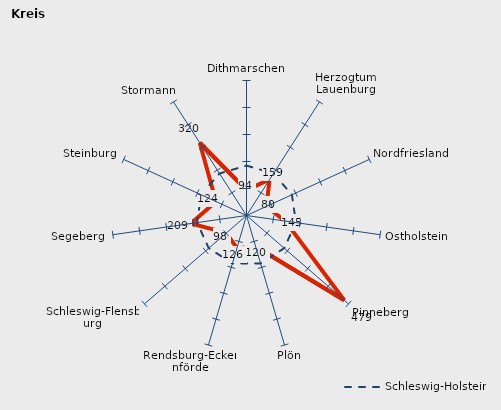
| Category | Kreise | Schleswig-Holstein |
|---|---|---|
| Dithmarschen | 93.804 | 184.887 |
| Herzogtum Lauenburg | 158.993 | 184.887 |
| Nordfriesland | 80.42 | 184.887 |
| Ostholstein | 145.019 | 184.887 |
| Pinneberg | 479.223 | 184.887 |
| Plön | 119.686 | 184.887 |
| Rendsburg-Eckernförde | 126.064 | 184.887 |
| Schleswig-Flensburg | 98.393 | 184.887 |
| Segeberg | 208.559 | 184.887 |
| Steinburg | 123.94 | 184.887 |
| Stormann | 320.284 | 184.887 |